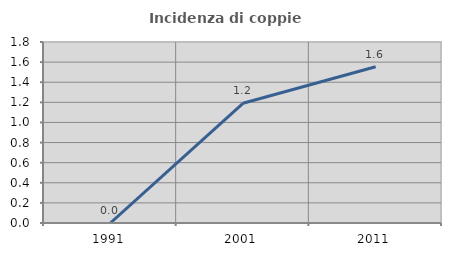
| Category | Incidenza di coppie miste |
|---|---|
| 1991.0 | 0 |
| 2001.0 | 1.19 |
| 2011.0 | 1.554 |